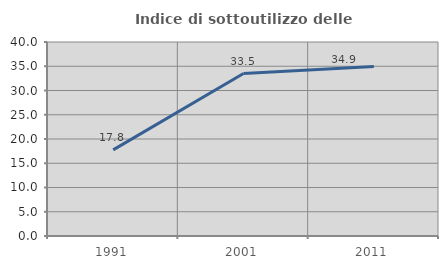
| Category | Indice di sottoutilizzo delle abitazioni  |
|---|---|
| 1991.0 | 17.759 |
| 2001.0 | 33.49 |
| 2011.0 | 34.934 |